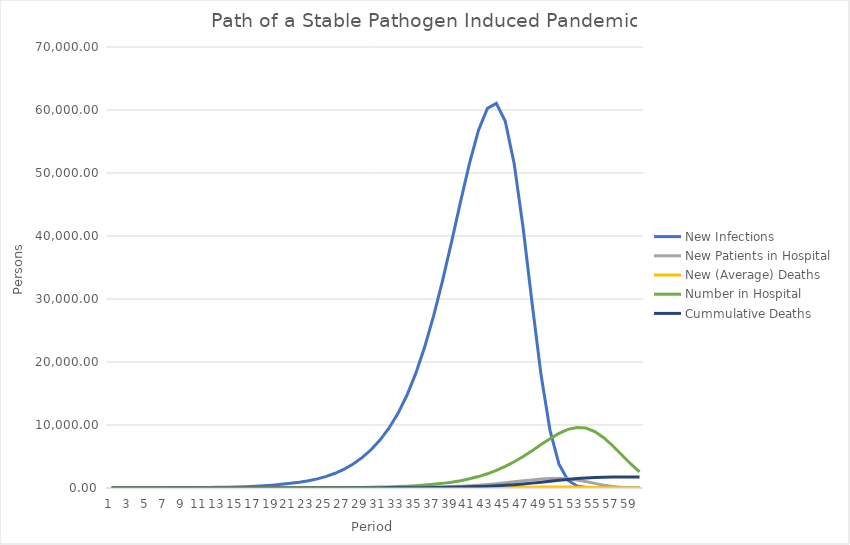
| Category | New Infections | New Patients in Hospital | New (Average) Deaths | Number in Hospital | Cummulative Deaths |
|---|---|---|---|---|---|
| 0 | 7.28 | 0.035 | 0.003 | 0.105 | 0.01 |
| 1 | 9.24 | 0.035 | 0.003 | 0.14 | 0.014 |
| 2 | 11.199 | 0.035 | 0.003 | 0.175 | 0.017 |
| 3 | 13.159 | 0.035 | 0.003 | 0.21 | 0.021 |
| 4 | 15.119 | 0.035 | 0.003 | 0.245 | 0.024 |
| 5 | 16.462 | 0.084 | 0.008 | 0.294 | 0.033 |
| 6 | 21.949 | 0.133 | 0.013 | 0.392 | 0.046 |
| 7 | 30.178 | 0.182 | 0.018 | 0.539 | 0.064 |
| 8 | 41.15 | 0.231 | 0.023 | 0.735 | 0.087 |
| 9 | 54.863 | 0.28 | 0.028 | 0.98 | 0.115 |
| 10 | 71.316 | 0.329 | 0.033 | 1.274 | 0.148 |
| 11 | 90.506 | 0.378 | 0.038 | 1.617 | 0.186 |
| 12 | 108.827 | 0.412 | 0.041 | 1.944 | 0.227 |
| 13 | 132.074 | 0.549 | 0.055 | 2.36 | 0.282 |
| 14 | 164.077 | 0.754 | 0.075 | 2.933 | 0.358 |
| 15 | 208.663 | 1.029 | 0.103 | 3.73 | 0.461 |
| 16 | 269.641 | 1.372 | 0.137 | 4.822 | 0.598 |
| 17 | 350.808 | 1.783 | 0.178 | 6.276 | 0.776 |
| 18 | 455.928 | 2.263 | 0.226 | 8.161 | 1.002 |
| 19 | 584.555 | 2.721 | 0.272 | 10.47 | 1.274 |
| 20 | 737.651 | 3.302 | 0.33 | 13.223 | 1.605 |
| 21 | 923.415 | 4.102 | 0.41 | 16.57 | 2.015 |
| 22 | 1155.254 | 5.217 | 0.522 | 20.758 | 2.536 |
| 23 | 1451.665 | 6.741 | 0.674 | 26.128 | 3.21 |
| 24 | 1836.038 | 8.77 | 0.877 | 33.115 | 4.087 |
| 25 | 2336.347 | 11.398 | 1.14 | 42.25 | 5.227 |
| 26 | 2983.891 | 14.614 | 1.461 | 54.144 | 6.689 |
| 27 | 3801.696 | 18.441 | 1.844 | 69.283 | 8.533 |
| 28 | 4816.509 | 23.085 | 2.309 | 88.266 | 10.841 |
| 29 | 6064.716 | 28.881 | 2.888 | 111.931 | 13.729 |
| 30 | 7597.197 | 36.292 | 3.629 | 141.482 | 17.359 |
| 31 | 9482.462 | 45.901 | 4.59 | 178.613 | 21.949 |
| 32 | 11807.068 | 58.409 | 5.841 | 225.623 | 27.79 |
| 33 | 14676.282 | 74.597 | 7.46 | 285.607 | 35.249 |
| 34 | 18187.268 | 95.042 | 9.504 | 362.208 | 44.754 |
| 35 | 22405.68 | 120.413 | 12.041 | 459.535 | 56.795 |
| 36 | 27346.285 | 151.618 | 15.162 | 582.272 | 71.957 |
| 37 | 32951.929 | 189.93 | 18.993 | 735.91 | 90.95 |
| 38 | 39067.652 | 237.062 | 23.706 | 927.07 | 114.656 |
| 39 | 45407.812 | 295.177 | 29.518 | 1163.838 | 144.173 |
| 40 | 51522.802 | 366.907 | 36.691 | 1456.148 | 180.864 |
| 41 | 56763.539 | 454.682 | 45.468 | 1815.788 | 226.332 |
| 42 | 60267.476 | 560.142 | 56.014 | 2255.517 | 282.347 |
| 43 | 61043.662 | 683.657 | 68.366 | 2787.556 | 350.712 |
| 44 | 58216.009 | 823.798 | 82.38 | 3421.424 | 433.092 |
| 45 | 51421.714 | 976.691 | 97.669 | 4161.054 | 530.761 |
| 46 | 41229.446 | 1135.195 | 113.52 | 5001.073 | 644.281 |
| 47 | 29289.985 | 1288.07 | 128.807 | 5922.236 | 773.088 |
| 48 | 17922.942 | 1419.088 | 141.909 | 6886.642 | 914.997 |
| 49 | 9154.886 | 1506.687 | 150.669 | 7833.187 | 1065.665 |
| 50 | 3785.519 | 1526.092 | 152.609 | 8675.622 | 1218.274 |
| 51 | 1242.498 | 1455.4 | 145.54 | 9307.224 | 1363.814 |
| 52 | 327.893 | 1285.543 | 128.554 | 9616.075 | 1492.369 |
| 53 | 74.828 | 1030.736 | 103.074 | 9511.616 | 1595.442 |
| 54 | 16.844 | 732.25 | 73.225 | 8955.796 | 1668.667 |
| 55 | 4.258 | 448.074 | 44.807 | 7984.781 | 1713.475 |
| 56 | 1.292 | 228.872 | 22.887 | 6706.966 | 1736.362 |
| 57 | 0.471 | 94.638 | 9.464 | 5275.513 | 1745.826 |
| 58 | 0.199 | 31.062 | 3.106 | 3851.175 | 1748.932 |
| 59 | 0.092 | 8.197 | 0.82 | 2573.829 | 1749.752 |